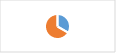
| Category | Section 1.B : Identification et prise en compte des attentes des parties-prenantes |
|---|---|
| Section 1.B : Identification et prise en compte des attentes des parties-prenantes | 0.333 |